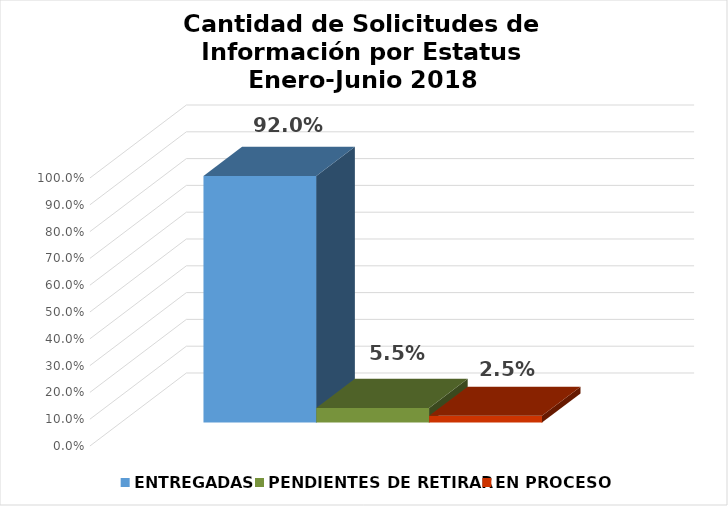
| Category | ENTREGADAS | PENDIENTES DE RETIRAR | EN PROCESO |
|---|---|---|---|
|  | 0.92 | 0.055 | 0.025 |